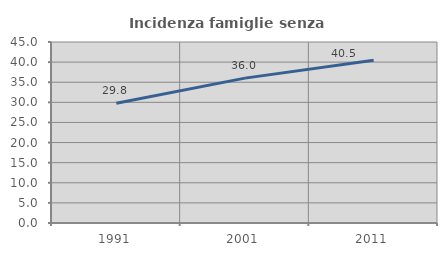
| Category | Incidenza famiglie senza nuclei |
|---|---|
| 1991.0 | 29.782 |
| 2001.0 | 36.015 |
| 2011.0 | 40.482 |